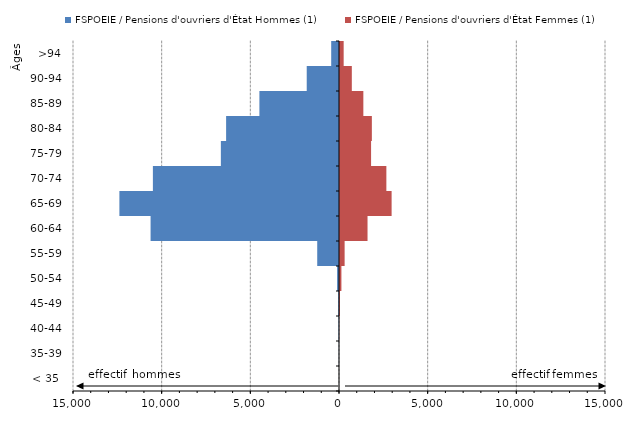
| Category | FSPOEIE / Pensions d'ouvriers d'État Hommes (1) | FSPOEIE / Pensions d'ouvriers d'État Femmes (1) |
|---|---|---|
| < 35  | 0 | 1 |
| 35-39 | -6 | 1 |
| 40-44 | -22 | 11 |
| 45-49 | -39 | 51 |
| 50-54 | -107 | 136 |
| 55-59 | -1228 | 317 |
| 60-64 | -10625 | 1609 |
| 65-69 | -12384 | 2967 |
| 70-74 | -10495 | 2671 |
| 75-79 | -6662 | 1809 |
| 80-84 | -6366 | 1853 |
| 85-89 | -4489 | 1373 |
| 90-94 | -1820 | 723 |
| >94 | -440 | 263 |